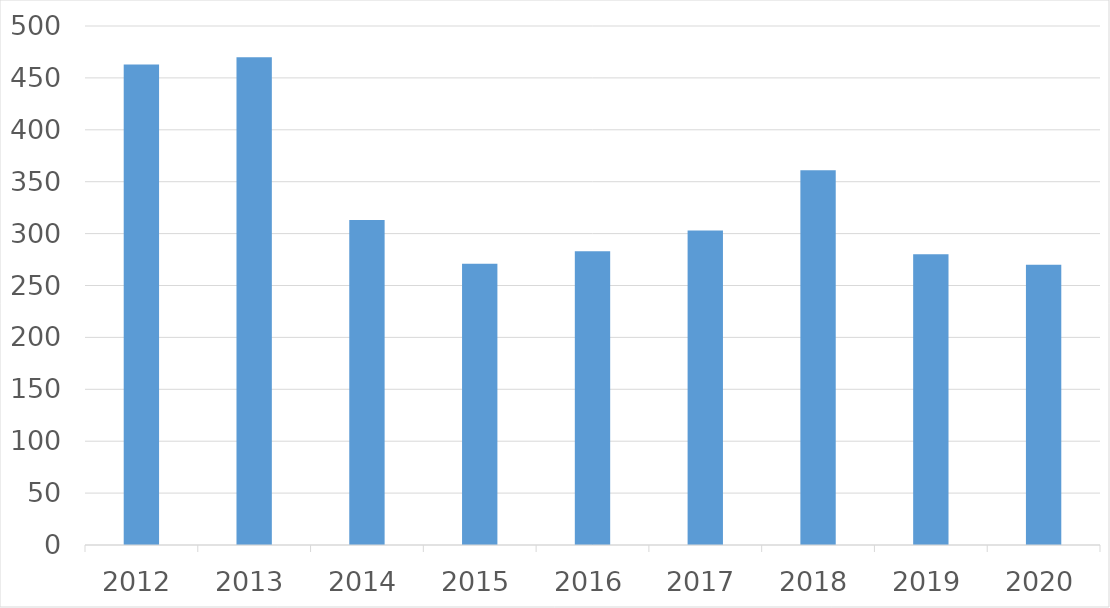
| Category | Series 0 |
|---|---|
| 2012 | 463 |
| 2013 | 470 |
| 2014 | 313 |
| 2015 | 271 |
| 2016 | 283 |
| 2017 | 303 |
| 2018 | 361 |
| 2019 | 280 |
| 2020 | 270 |